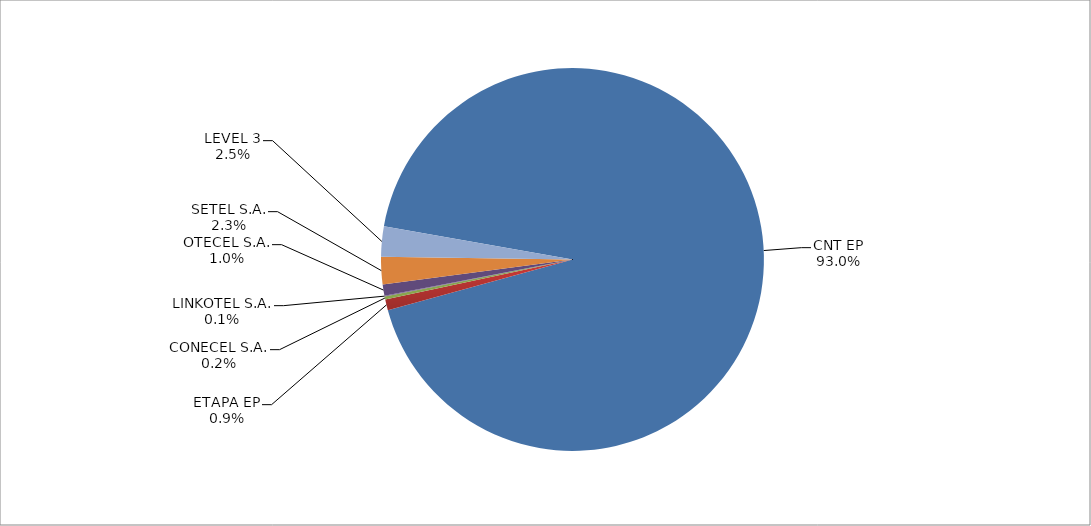
| Category | Series 0 |
|---|---|
| CNT EP | 2625 |
| ETAPA EP | 26 |
| CONECEL S.A. | 7 |
| LINKOTEL S.A. | 2 |
| OTECEL S.A. | 27 |
| SETEL S.A. | 65 |
| LEVEL 3 | 72 |